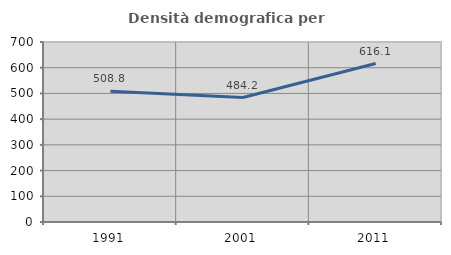
| Category | Densità demografica |
|---|---|
| 1991.0 | 508.805 |
| 2001.0 | 484.159 |
| 2011.0 | 616.131 |